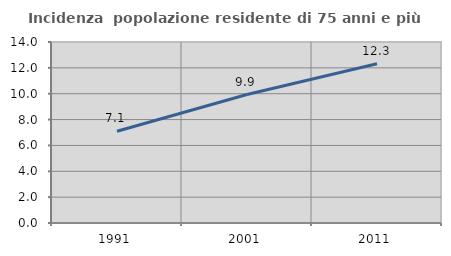
| Category | Incidenza  popolazione residente di 75 anni e più |
|---|---|
| 1991.0 | 7.093 |
| 2001.0 | 9.939 |
| 2011.0 | 12.316 |